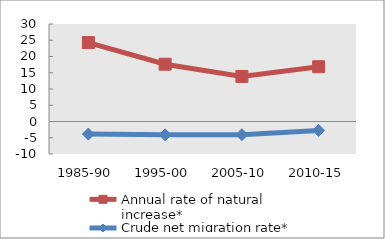
| Category | Annual rate of natural increase* | Crude net migration rate* |
|---|---|---|
| 1985-90 | 24.29 | -3.866 |
| 1995-00 | 17.629 | -4.111 |
| 2005-10 | 13.87 | -4.047 |
| 2010-15 | 16.847 | -2.744 |